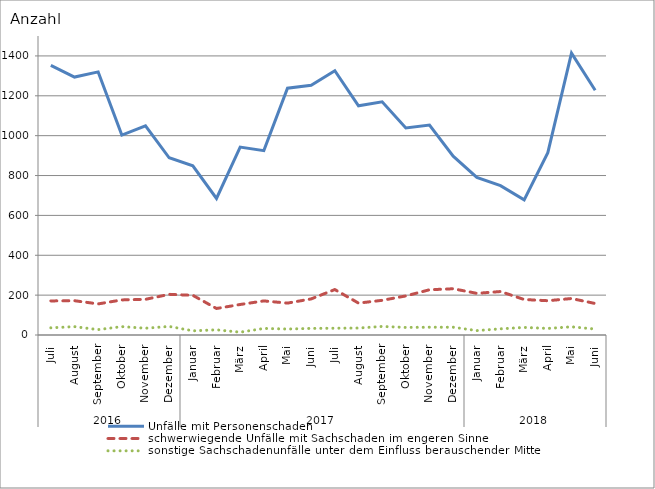
| Category | Unfälle mit Personenschaden | schwerwiegende Unfälle mit Sachschaden im engeren Sinne | sonstige Sachschadenunfälle unter dem Einfluss berauschender Mittel |
|---|---|---|---|
| 0 | 1353 | 171 | 36 |
| 1 | 1294 | 172 | 42 |
| 2 | 1320 | 156 | 27 |
| 3 | 1003 | 176 | 42 |
| 4 | 1049 | 179 | 34 |
| 5 | 889 | 204 | 43 |
| 6 | 849 | 199 | 21 |
| 7 | 685 | 133 | 26 |
| 8 | 943 | 153 | 14 |
| 9 | 925 | 171 | 33 |
| 10 | 1238 | 160 | 30 |
| 11 | 1253 | 181 | 33 |
| 12 | 1326 | 228 | 34 |
| 13 | 1150 | 160 | 35 |
| 14 | 1170 | 174 | 43 |
| 15 | 1039 | 196 | 38 |
| 16 | 1053 | 227 | 39 |
| 17 | 897 | 232 | 39 |
| 18 | 791 | 209 | 22 |
| 19 | 749 | 218 | 31 |
| 20 | 678 | 178 | 38 |
| 21 | 915 | 172 | 33 |
| 22 | 1414 | 183 | 41 |
| 23 | 1228 | 158 | 30 |